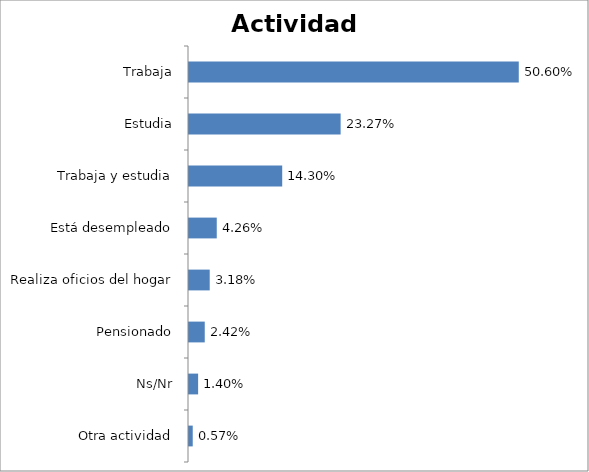
| Category | Total |
|---|---|
| Otra actividad | 0.006 |
| Ns/Nr | 0.014 |
| Pensionado | 0.024 |
| Realiza oficios del hogar | 0.032 |
| Está desempleado | 0.043 |
| Trabaja y estudia | 0.143 |
| Estudia | 0.233 |
| Trabaja | 0.506 |